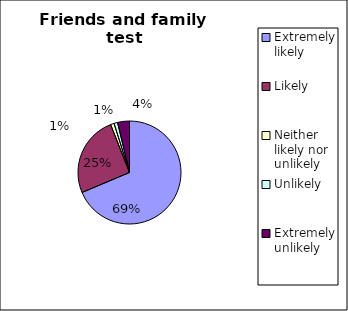
| Category | counters |
|---|---|
| Extremely likely  | 184 |
| Likely  | 68 |
| Neither likely nor unlikely | 3 |
| Unlikely  | 3 |
| Extremely unlikely  | 10 |